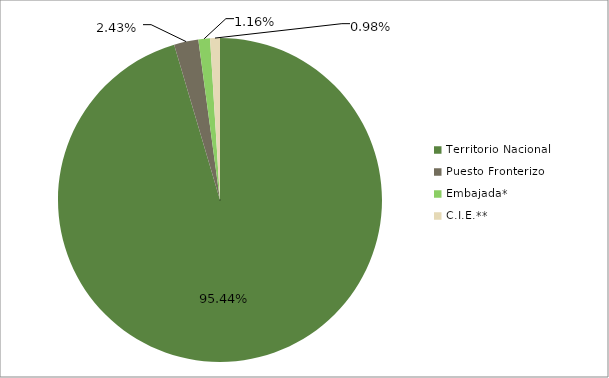
| Category | Series 0 |
|---|---|
| Territorio Nacional  | 0.954 |
| Puesto Fronterizo | 0.024 |
| Embajada* | 0.012 |
| C.I.E.** | 0.01 |